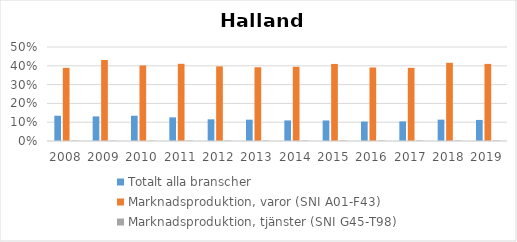
| Category | Totalt alla branscher | Marknadsproduktion, varor (SNI A01-F43) | Marknadsproduktion, tjänster (SNI G45-T98) |
|---|---|---|---|
| 2008 | 0.134 | 0.389 | 0.002 |
| 2009 | 0.131 | 0.431 | 0.002 |
| 2010 | 0.134 | 0.402 | 0.002 |
| 2011 | 0.126 | 0.411 | 0.002 |
| 2012 | 0.115 | 0.397 | 0.002 |
| 2013 | 0.113 | 0.392 | 0.003 |
| 2014 | 0.109 | 0.395 | 0.003 |
| 2015 | 0.109 | 0.41 | 0.003 |
| 2016 | 0.104 | 0.391 | 0.003 |
| 2017 | 0.104 | 0.389 | 0.003 |
| 2018 | 0.114 | 0.416 | 0.003 |
| 2019 | 0.112 | 0.41 | 0.003 |